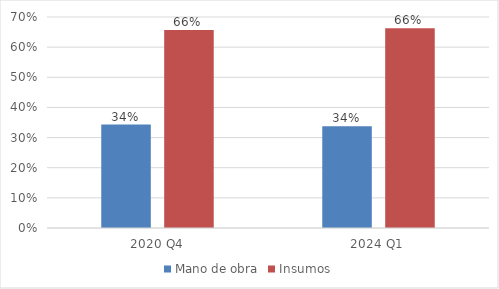
| Category | Mano de obra | Insumos |
|---|---|---|
| 2020 Q4 | 0.343 | 0.657 |
| 2024 Q1 | 0.338 | 0.662 |